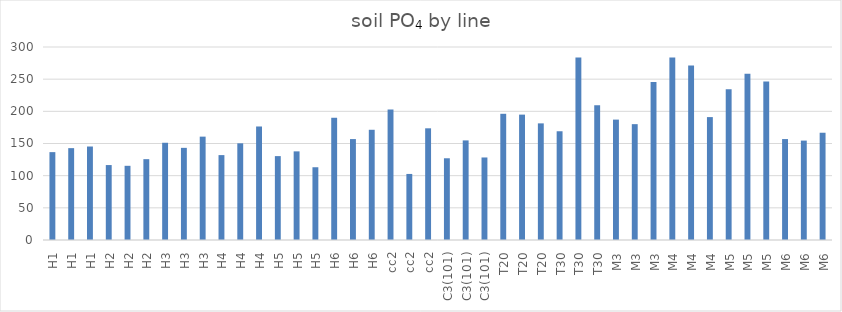
| Category | soil PO4 (mg/kg) |
|---|---|
| H1 | 136.589 |
| H1 | 142.787 |
| H1 | 145.322 |
| H2 | 116.49 |
| H2 | 115.328 |
| H2 | 125.657 |
| H3 | 151.141 |
| H3 | 143.238 |
| H3 | 160.666 |
| H4 | 131.966 |
| H4 | 150.288 |
| H4 | 176.447 |
| H5 | 130.397 |
| H5 | 137.77 |
| H5 | 113.096 |
| H6 | 190.007 |
| H6 | 156.87 |
| H6 | 171.327 |
| cc2 | 202.787 |
| cc2 | 102.677 |
| cc2 | 173.614 |
| C3(101) | 127.037 |
| C3(101) | 154.804 |
| C3(101) | 128.282 |
| T20 | 196.169 |
| T20 | 194.894 |
| T20 | 181.29 |
| T30 | 169.032 |
| T30 | 283.549 |
| T30 | 209.295 |
| M3 | 187.132 |
| M3 | 180.077 |
| M3 | 245.52 |
| M4 | 283.678 |
| M4 | 271.098 |
| M4 | 191.049 |
| M5 | 234.144 |
| M5 | 258.443 |
| M5 | 246.541 |
| M6 | 156.89 |
| M6 | 154.519 |
| M6 | 166.726 |